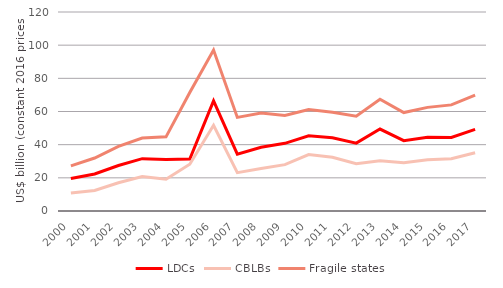
| Category | LDCs | CBLBs | Fragile states |
|---|---|---|---|
| 2000 | 19587.8 | 10904.2 | 27248.96 |
| 2001 | 22313.05 | 12404.05 | 31968.9 |
| 2002 | 27455.78 | 17032.96 | 38958.81 |
| 2003 | 31549.36 | 20805.7 | 44031.01 |
| 2004 | 30993.96 | 19173.57 | 44716.56 |
| 2005 | 31289.79 | 28200.56 | 71473.1 |
| 2006 | 66428 | 51707.76 | 97058.61 |
| 2007 | 34279.88 | 23100.78 | 56446.63 |
| 2008 | 38445.39 | 25617.95 | 59061.33 |
| 2009 | 40792.39 | 27962.6 | 57615.71 |
| 2010 | 45310.8 | 34044.56 | 61181.64 |
| 2011 | 44189.92 | 32382.49 | 59489.22 |
| 2012 | 40931.42 | 28490.93 | 57170.62 |
| 2013 | 49407.2 | 30323.02 | 67422.25 |
| 2014 | 42401.92 | 29098.4 | 59364.04 |
| 2015 | 44435.94 | 30851.42 | 62486.29 |
| 2016 | 44360.15 | 31462.02 | 63984.88 |
| 2017 | 49176.14 | 35103.11 | 69942.05 |